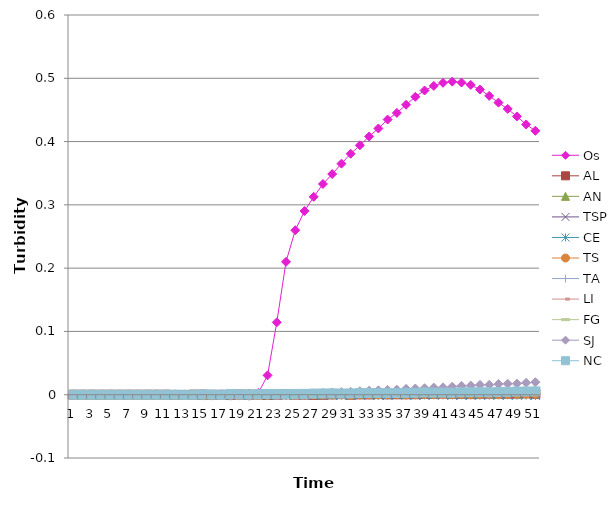
| Category | Os | AL | AN | TSP | CE | TS | TA | LI | FG | SJ | NC |
|---|---|---|---|---|---|---|---|---|---|---|---|
| 0 | 0 | 0 | 0 | 0 | 0 | 0 | 0 | 0 | 0 | 0 | 0 |
| 1 | 0 | 0 | 0 | 0 | 0 | 0 | 0 | 0 | 0 | 0 | 0 |
| 2 | 0 | 0 | 0 | 0 | 0 | 0 | 0 | 0 | 0 | 0 | 0 |
| 3 | 0 | 0 | 0 | 0 | 0 | 0 | 0 | 0 | 0 | 0 | 0 |
| 4 | 0 | 0 | 0 | 0 | 0 | 0 | 0 | 0 | 0 | 0 | 0 |
| 5 | 0 | 0 | 0 | 0 | 0 | 0 | 0 | 0 | 0 | 0 | 0 |
| 6 | 0 | 0 | 0 | 0 | 0 | 0 | 0 | 0 | 0 | 0 | 0 |
| 7 | 0 | 0 | 0 | 0 | 0 | 0 | 0 | 0 | 0 | 0 | 0 |
| 8 | 0 | 0 | 0 | 0 | 0 | 0 | 0 | 0 | 0 | 0 | 0 |
| 9 | 0 | 0 | 0 | 0 | 0 | 0 | 0 | 0 | 0 | 0 | 0 |
| 10 | 0 | 0 | 0 | 0 | 0 | 0 | 0 | 0 | 0 | 0 | 0 |
| 11 | 0 | 0 | 0 | 0 | 0 | 0 | 0 | 0 | 0 | 0 | 0 |
| 12 | 0 | 0 | 0 | 0 | 0 | 0 | 0 | 0 | 0 | 0 | 0 |
| 13 | 0 | 0 | 0 | -0.001 | 0 | 0 | 0 | 0 | 0 | -0.001 | 0 |
| 14 | 0 | 0 | 0 | -0.001 | 0 | 0 | 0 | 0 | 0 | -0.001 | 0.001 |
| 15 | 0 | 0 | 0 | 0 | -0.001 | -0.001 | 0.001 | 0 | 0 | -0.001 | 0 |
| 16 | 0 | 0 | 0 | -0.001 | 0 | 0 | 0.001 | 0 | 0 | -0.001 | 0 |
| 17 | 0.001 | 0 | 0 | -0.001 | 0 | 0 | 0.001 | 0 | 0 | -0.002 | 0.001 |
| 18 | 0.001 | 0 | 0.001 | -0.001 | -0.001 | -0.001 | 0.001 | 0 | 0 | -0.001 | 0.001 |
| 19 | 0.002 | 0 | 0.001 | -0.001 | -0.001 | 0 | 0.001 | 0 | 0.001 | -0.002 | 0 |
| 20 | 0.003 | 0 | 0 | 0 | 0 | 0 | 0.001 | 0 | 0.001 | -0.001 | 0.001 |
| 21 | 0.031 | 0 | 0 | -0.001 | 0 | 0 | 0.001 | 0 | 0.001 | -0.001 | 0.001 |
| 22 | 0.114 | 0 | 0.001 | -0.001 | -0.001 | 0 | 0.002 | 0 | 0.001 | -0.001 | 0.001 |
| 23 | 0.21 | 0.001 | 0.001 | -0.001 | -0.001 | 0 | 0.002 | 0 | 0.001 | -0.001 | 0.001 |
| 24 | 0.26 | 0 | 0.001 | -0.001 | 0 | 0 | 0.001 | 0 | 0.001 | 0 | 0.001 |
| 25 | 0.29 | 0 | 0.001 | -0.001 | -0.001 | 0 | 0.002 | 0 | 0.001 | 0.001 | 0.001 |
| 26 | 0.313 | 0 | 0.001 | 0 | 0 | 0.001 | 0.002 | 0 | 0.001 | 0.002 | 0.002 |
| 27 | 0.333 | 0 | 0.002 | -0.001 | -0.001 | 0.001 | 0.002 | 0 | 0.001 | 0.003 | 0.002 |
| 28 | 0.349 | 0 | 0.002 | 0 | -0.001 | 0.001 | 0.002 | 0 | 0.001 | 0.004 | 0.002 |
| 29 | 0.365 | 0.001 | 0.002 | -0.001 | -0.001 | 0.001 | 0.002 | 0 | 0.002 | 0.004 | 0.002 |
| 30 | 0.381 | 0 | 0.002 | -0.001 | -0.001 | 0 | 0.002 | 0 | 0.002 | 0.005 | 0.002 |
| 31 | 0.394 | 0 | 0.002 | 0 | 0 | 0.001 | 0.003 | 0 | 0.002 | 0.006 | 0.003 |
| 32 | 0.408 | 0 | 0.002 | -0.001 | 0 | 0.001 | 0.003 | 0 | 0.002 | 0.006 | 0.003 |
| 33 | 0.421 | 0.001 | 0.002 | -0.001 | -0.001 | 0 | 0.003 | 0 | 0.001 | 0.007 | 0.003 |
| 34 | 0.435 | 0.001 | 0.003 | -0.001 | -0.001 | 0.001 | 0.003 | 0 | 0.002 | 0.008 | 0.003 |
| 35 | 0.445 | 0.001 | 0.003 | 0 | 0 | 0.001 | 0.003 | 0 | 0.002 | 0.008 | 0.003 |
| 36 | 0.458 | 0.001 | 0.003 | 0 | 0 | 0 | 0.003 | 0 | 0.002 | 0.009 | 0.003 |
| 37 | 0.471 | 0.001 | 0.002 | -0.001 | 0 | 0.001 | 0.003 | 0 | 0.002 | 0.01 | 0.003 |
| 38 | 0.481 | 0.001 | 0.003 | -0.001 | 0 | 0.001 | 0.004 | 0 | 0.002 | 0.01 | 0.004 |
| 39 | 0.488 | 0.001 | 0.003 | 0 | 0 | 0.001 | 0.004 | 0 | 0.002 | 0.011 | 0.003 |
| 40 | 0.493 | 0.002 | 0.003 | 0 | 0 | 0.001 | 0.004 | 0.001 | 0.002 | 0.012 | 0.003 |
| 41 | 0.495 | 0.001 | 0.003 | -0.001 | 0 | 0.001 | 0.004 | 0.001 | 0.002 | 0.013 | 0.003 |
| 42 | 0.493 | 0.001 | 0.004 | -0.001 | 0 | 0.001 | 0.004 | 0.001 | 0.003 | 0.014 | 0.004 |
| 43 | 0.49 | 0.001 | 0.003 | -0.001 | 0 | 0.001 | 0.004 | 0 | 0.003 | 0.014 | 0.004 |
| 44 | 0.482 | 0.002 | 0.003 | 0 | -0.001 | 0.001 | 0.005 | 0.001 | 0.003 | 0.016 | 0.004 |
| 45 | 0.472 | 0.002 | 0.004 | 0 | -0.001 | 0.001 | 0.004 | 0.001 | 0.003 | 0.016 | 0.004 |
| 46 | 0.462 | 0.002 | 0.004 | 0 | 0 | 0.001 | 0.005 | 0.001 | 0.003 | 0.017 | 0.004 |
| 47 | 0.452 | 0.002 | 0.005 | -0.001 | 0 | 0.002 | 0.005 | 0.001 | 0.003 | 0.017 | 0.004 |
| 48 | 0.44 | 0.002 | 0.004 | 0 | -0.001 | 0.002 | 0.005 | 0 | 0.003 | 0.018 | 0.005 |
| 49 | 0.427 | 0.002 | 0.004 | 0 | -0.001 | 0.002 | 0.005 | 0.001 | 0.003 | 0.019 | 0.005 |
| 50 | 0.417 | 0.001 | 0.005 | -0.001 | -0.001 | 0.002 | 0.006 | 0.001 | 0.004 | 0.02 | 0.005 |